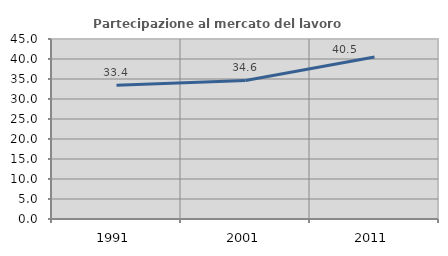
| Category | Partecipazione al mercato del lavoro  femminile |
|---|---|
| 1991.0 | 33.449 |
| 2001.0 | 34.643 |
| 2011.0 | 40.508 |